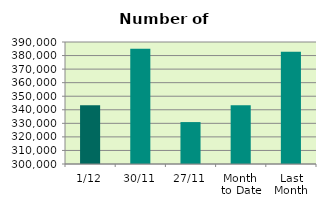
| Category | Series 0 |
|---|---|
| 1/12 | 343328 |
| 30/11 | 384990 |
| 27/11 | 330924 |
| Month 
to Date | 343328 |
| Last
Month | 382855.048 |